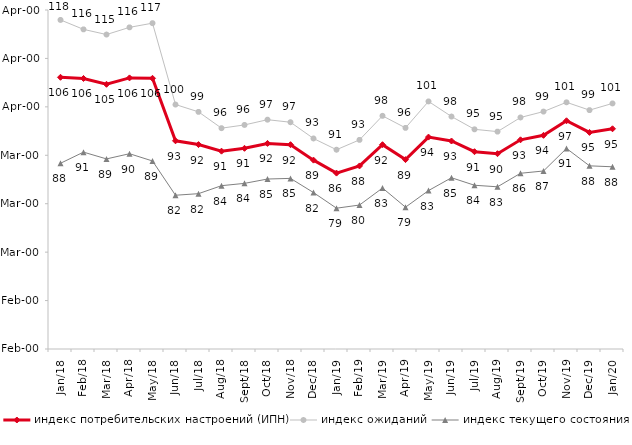
| Category | индекс потребительских настроений (ИПН) | Series 0 | индекс ожиданий | Series 3 | индекс текущего состояния |
|---|---|---|---|---|---|
| 2018-01-01 | 106.11 | 2018-01-01 | 117.95 | 2018-01-01 | 88.35 |
| 2018-02-01 | 105.86 | 2018-02-01 | 116 | 2018-02-01 | 90.65 |
| 2018-03-01 | 104.66 | 2018-03-01 | 114.933 | 2018-03-01 | 89.25 |
| 2018-04-01 | 105.98 | 2018-04-01 | 116.417 | 2018-04-01 | 90.325 |
| 2018-05-01 | 105.9 | 2018-05-01 | 117.283 | 2018-05-01 | 88.825 |
| 2018-06-01 | 92.99 | 2018-06-01 | 100.483 | 2018-06-01 | 81.75 |
| 2018-07-01 | 92.21 | 2018-07-01 | 98.967 | 2018-07-01 | 82.075 |
| 2018-08-01 | 90.85 | 2018-08-01 | 95.6 | 2018-08-01 | 83.725 |
| 2018-09-01 | 91.44 | 2018-09-01 | 96.267 | 2018-09-01 | 84.2 |
| 2018-10-01 | 92.45 | 2018-10-01 | 97.35 | 2018-10-01 | 85.1 |
| 2018-11-01 | 92.186 | 2018-11-01 | 96.823 | 2018-11-01 | 85.23 |
| 2018-12-01 | 89 | 2018-12-01 | 93.467 | 2018-12-01 | 82.3 |
| 2019-01-01 | 86.32 | 2019-01-01 | 91.15 | 2019-01-01 | 79.075 |
| 2019-02-01 | 87.8 | 2019-02-01 | 93.183 | 2019-02-01 | 79.725 |
| 2019-03-01 | 92.183 | 2019-03-01 | 98.144 | 2019-03-01 | 83.242 |
| 2019-04-01 | 89.109 | 2019-04-01 | 95.66 | 2019-04-01 | 79.282 |
| 2019-05-01 | 93.759 | 2019-05-01 | 101.123 | 2019-05-01 | 82.714 |
| 2019-06-01 | 92.948 | 2019-06-01 | 98.005 | 2019-06-01 | 85.362 |
| 2019-07-01 | 90.743 | 2019-07-01 | 95.363 | 2019-07-01 | 83.812 |
| 2019-08-01 | 90.33 | 2019-08-01 | 94.888 | 2019-08-01 | 83.492 |
| 2019-09-01 | 93.198 | 2019-09-01 | 97.805 | 2019-09-01 | 86.287 |
| 2019-10-01 | 94.119 | 2019-10-01 | 99.026 | 2019-10-01 | 86.757 |
| 2019-11-01 | 97.129 | 2019-11-01 | 100.941 | 2019-11-01 | 91.411 |
| 2019-12-01 | 94.723 | 2019-12-01 | 99.323 | 2019-12-01 | 87.822 |
| 2020-01-01 | 95.475 | 2020-01-01 | 100.71 | 2020-01-01 | 87.624 |